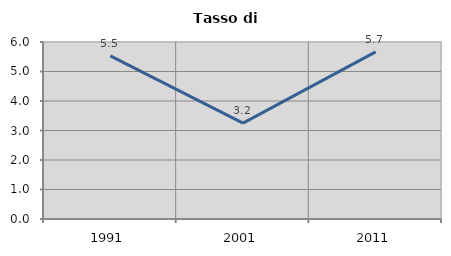
| Category | Tasso di disoccupazione   |
|---|---|
| 1991.0 | 5.527 |
| 2001.0 | 3.248 |
| 2011.0 | 5.666 |